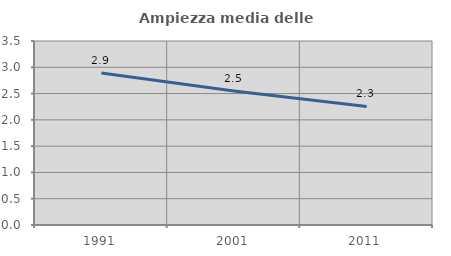
| Category | Ampiezza media delle famiglie |
|---|---|
| 1991.0 | 2.891 |
| 2001.0 | 2.549 |
| 2011.0 | 2.254 |